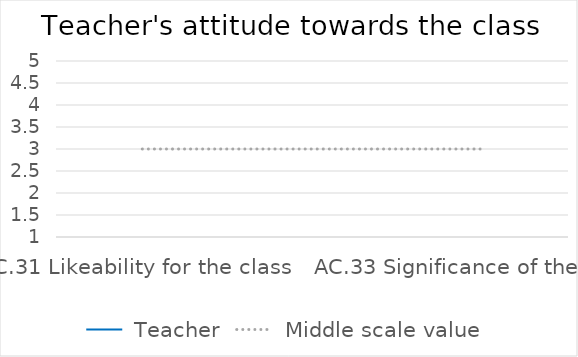
| Category |  Teacher |  Middle scale value |
|---|---|---|
| AC.31 Likeability for the class | 0 | 3 |
| AC.32 Pleasure to teach the class  | 0 | 3 |
| AC.33 Significance of the class | 0 | 3 |